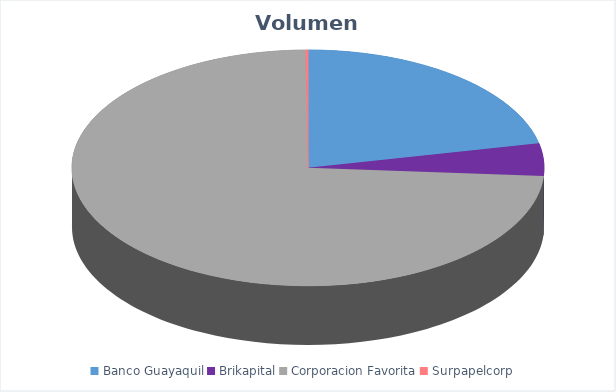
| Category | VOLUMEN ($USD) |
|---|---|
| Banco Guayaquil | 48535.85 |
| Brikapital | 10000 |
| Corporacion Favorita | 165407.94 |
| Surpapelcorp | 382.5 |